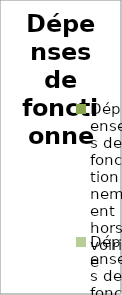
| Category | Series 0 |
|---|---|
| Dépenses de fonctionnement hors voirie | 0 |
| Dépenses de fonctionnement voirie hors personnel | 0 |